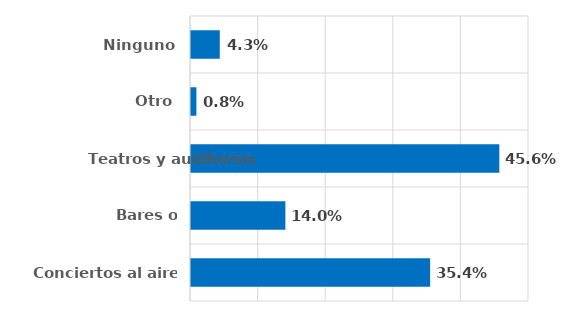
| Category | Series 0 |
|---|---|
| Conciertos al aire libre | 0.354 |
| Bares o restaurantes | 0.14 |
| Teatros y auditorios | 0.456 |
| Otro | 0.008 |
| Ninguno | 0.043 |